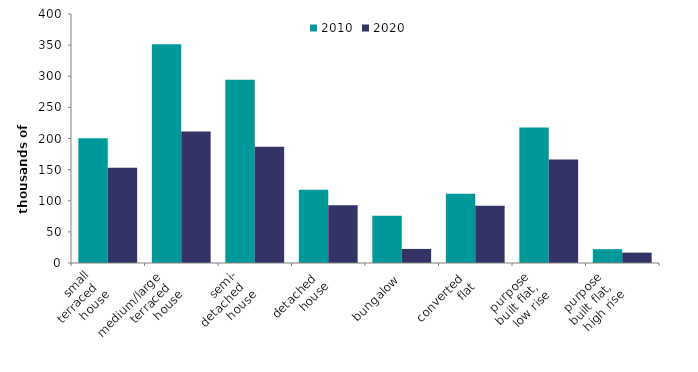
| Category | 2010 | 2020 |
|---|---|---|
| small
 terraced 
house | 200.203 | 153.162 |
| medium/large 
terraced 
house | 351.276 | 211.319 |
| semi-
detached 
house | 294.503 | 186.756 |
| detached 
house | 117.759 | 92.723 |
| bungalow | 76.097 | 22.623 |
| converted 
flat | 111.063 | 92.09 |
| purpose 
built flat, 
low rise | 217.615 | 166.108 |
| purpose 
built flat, 
high rise | 22.268 | 16.661 |